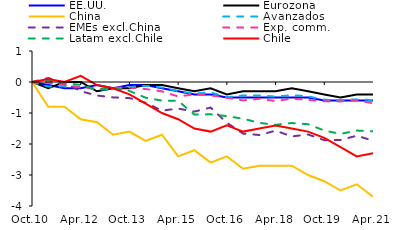
| Category | EE.UU. | Eurozona | China | Avanzados | EMEs excl.China | Exp. comm. | Latam excl.Chile | Chile |
|---|---|---|---|---|---|---|---|---|
| 2010-10-01 | 0 | 0 | 0 | 0 | 0 | 0 | 0 | 0 |
| 2011-04-01 | -0.1 | -0.2 | -0.8 | -0.142 | 0.129 | -0.027 | 0.049 | 0.1 |
| 2011-10-01 | -0.2 | 0 | -0.8 | -0.137 | -0.022 | -0.093 | -0.042 | 0 |
| 2012-04-01 | -0.2 | 0 | -1.2 | -0.16 | -0.297 | -0.179 | -0.092 | 0.2 |
| 2012-10-01 | -0.1 | -0.3 | -1.3 | -0.23 | -0.435 | -0.221 | -0.251 | -0.1 |
| 2013-04-01 | -0.2 | -0.2 | -1.7 | -0.236 | -0.497 | -0.183 | -0.193 | -0.2 |
| 2013-10-01 | -0.1 | -0.2 | -1.6 | -0.166 | -0.519 | -0.179 | -0.288 | -0.4 |
| 2014-04-01 | -0.1 | -0.1 | -1.9 | -0.127 | -0.669 | -0.227 | -0.507 | -0.7 |
| 2014-10-01 | -0.2 | -0.1 | -1.7 | -0.18 | -0.922 | -0.3 | -0.6 | -1 |
| 2015-04-01 | -0.3 | -0.2 | -2.4 | -0.29 | -0.857 | -0.465 | -0.607 | -1.2 |
| 2015-10-01 | -0.4 | -0.3 | -2.2 | -0.365 | -0.955 | -0.4 | -1.051 | -1.5 |
| 2016-04-01 | -0.4 | -0.2 | -2.6 | -0.347 | -0.825 | -0.431 | -1.042 | -1.6 |
| 2016-10-01 | -0.5 | -0.4 | -2.4 | -0.478 | -1.315 | -0.507 | -1.1 | -1.4 |
| 2017-04-01 | -0.5 | -0.3 | -2.8 | -0.435 | -1.665 | -0.593 | -1.185 | -1.6 |
| 2017-10-01 | -0.5 | -0.3 | -2.7 | -0.437 | -1.71 | -0.541 | -1.319 | -1.5 |
| 2018-04-01 | -0.5 | -0.3 | -2.7 | -0.466 | -1.571 | -0.617 | -1.381 | -1.4 |
| 2018-10-01 | -0.5 | -0.2 | -2.7 | -0.433 | -1.756 | -0.534 | -1.324 | -1.5 |
| 2019-04-01 | -0.5 | -0.3 | -3 | -0.469 | -1.693 | -0.579 | -1.361 | -1.6 |
| 2019-10-01 | -0.6 | -0.4 | -3.2 | -0.564 | -1.878 | -0.624 | -1.566 | -1.8 |
| 2020-04-01 | -0.6 | -0.5 | -3.5 | -0.591 | -1.871 | -0.627 | -1.675 | -2.1 |
| 2020-10-01 | -0.6 | -0.4 | -3.3 | -0.562 | -1.732 | -0.589 | -1.566 | -2.4 |
| 2021-04-01 | -0.6 | -0.4 | -3.7 | -0.586 | -1.893 | -0.686 | -1.592 | -2.3 |